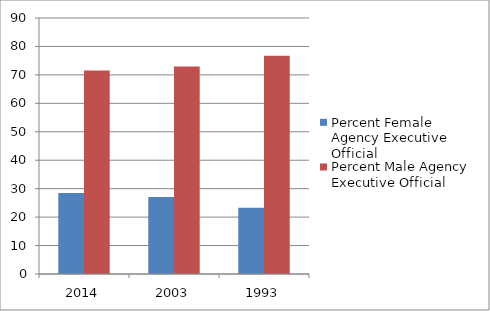
| Category | Percent Female Agency Executive Official | Percent Male Agency Executive Official |
|---|---|---|
| 2014.0 | 28.44 | 71.56 |
| 2003.0 | 27.027 | 72.973 |
| 1993.0 | 23.301 | 76.699 |